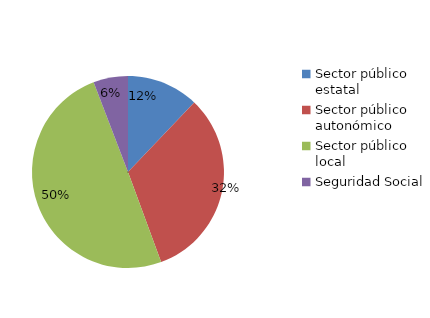
| Category | Series 0 |
|---|---|
| Sector público estatal | 27 |
| Sector público autonómico | 72 |
| Sector público local | 111 |
| Seguridad Social | 13 |